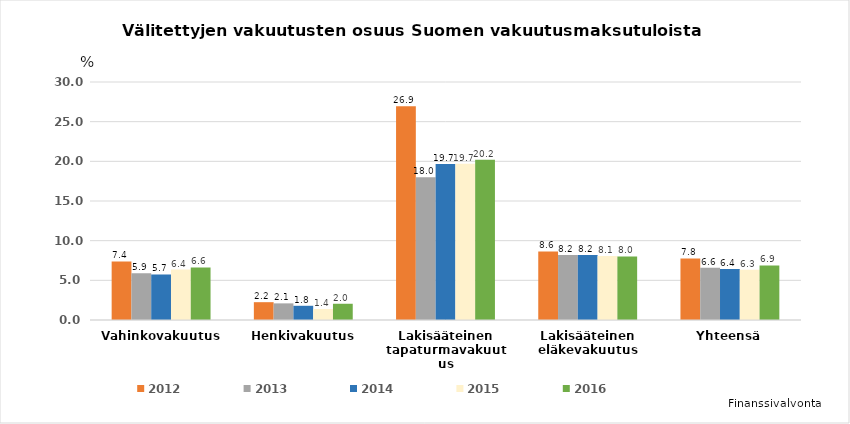
| Category | 2012 | 2013 | 2014 | 2015 | 2016 |
|---|---|---|---|---|---|
| Vahinkovakuutus | 7.375 | 5.882 | 5.737 | 6.356 | 6.621 |
| Henkivakuutus | 2.246 | 2.097 | 1.791 | 1.39 | 2.047 |
| Lakisääteinen tapaturmavakuutus | 26.944 | 17.98 | 19.654 | 19.692 | 20.194 |
| Lakisääteinen eläkevakuutus | 8.637 | 8.204 | 8.203 | 8.075 | 8.016 |
| Yhteensä | 7.754 | 6.584 | 6.436 | 6.337 | 6.875 |